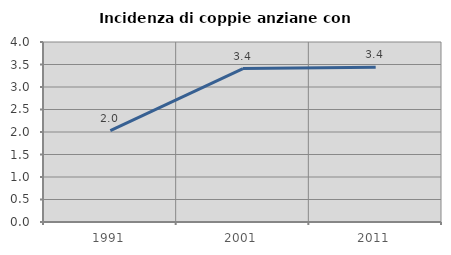
| Category | Incidenza di coppie anziane con figli |
|---|---|
| 1991.0 | 2.032 |
| 2001.0 | 3.41 |
| 2011.0 | 3.439 |